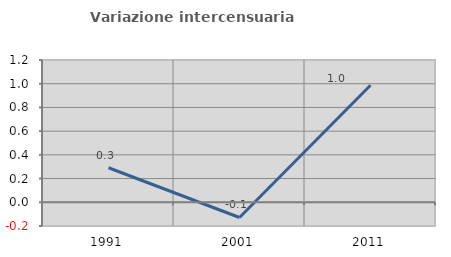
| Category | Variazione intercensuaria annua |
|---|---|
| 1991.0 | 0.291 |
| 2001.0 | -0.128 |
| 2011.0 | 0.987 |